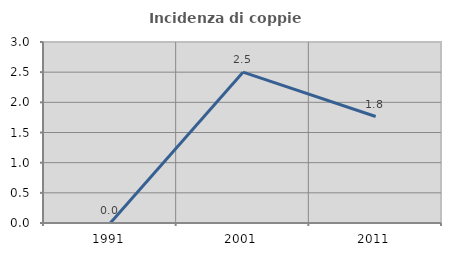
| Category | Incidenza di coppie miste |
|---|---|
| 1991.0 | 0 |
| 2001.0 | 2.5 |
| 2011.0 | 1.765 |